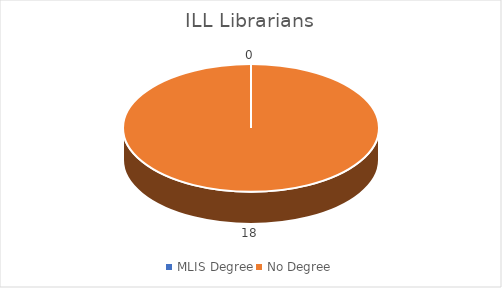
| Category | Series 0 |
|---|---|
| MLIS Degree | 0 |
| No Degree | 18 |